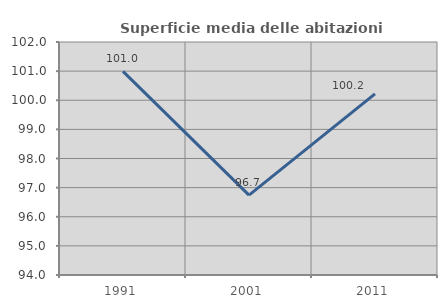
| Category | Superficie media delle abitazioni occupate |
|---|---|
| 1991.0 | 100.992 |
| 2001.0 | 96.741 |
| 2011.0 | 100.217 |